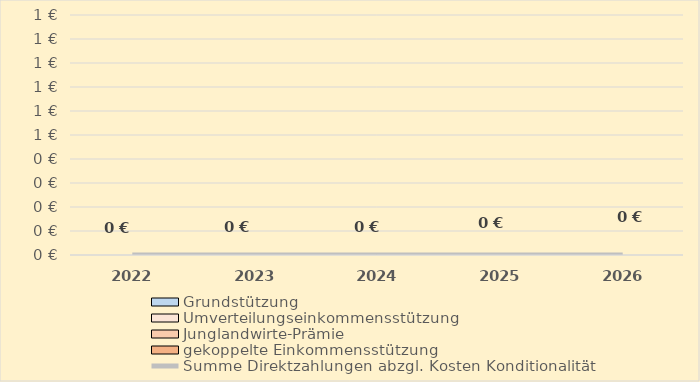
| Category | Grundstützung | Umverteilungseinkommensstützung | Junglandwirte-Prämie | gekoppelte Einkommensstützung |
|---|---|---|---|---|
| 2022.0 | 0 | 0 | 0 | 0 |
| 2023.0 | 0 | 0 | 0 | 0 |
| 2024.0 | 0 | 0 | 0 | 0 |
| 2025.0 | 0 | 0 | 0 | 0 |
| 2026.0 | 0 | 0 | 0 | 0 |